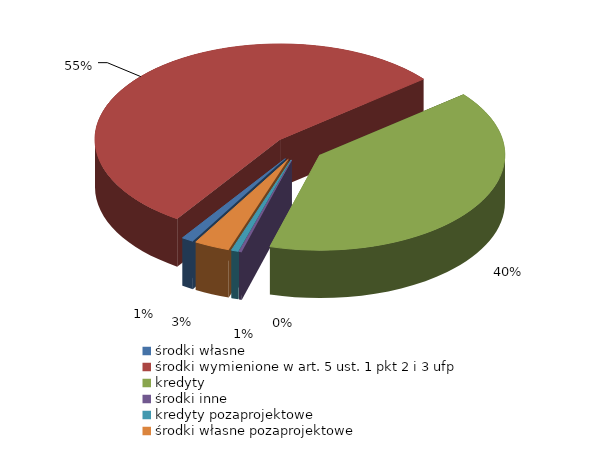
| Category | Series 0 |
|---|---|
| środki własne | 1765944.28 |
| środki wymienione w art. 5 ust. 1 pkt 2 i 3 ufp | 92235827.57 |
| kredyty | 67847525.33 |
| środki inne | 413085.79 |
| kredyty pozaprojektowe | 1054147.27 |
| środki własne pozaprojektowe | 5251629.99 |